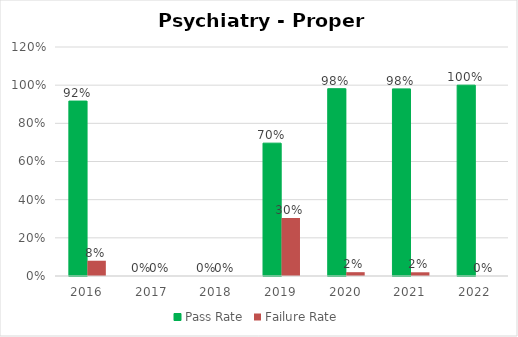
| Category | Pass Rate | Failure Rate |
|---|---|---|
| 2016.0 | 0.917 | 0.08 |
| 2017.0 | 0 | 0 |
| 2018.0 | 0 | 0 |
| 2019.0 | 0.696 | 0.304 |
| 2020.0 | 0.981 | 0.02 |
| 2021.0 | 0.981 | 0.019 |
| 2022.0 | 1 | 0 |